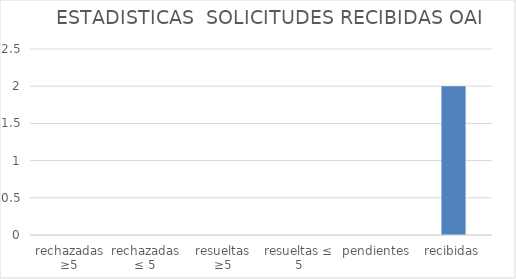
| Category | Series 0 |
|---|---|
| rechazadas ≥5 | 0 |
| rechazadas ≤ 5 | 0 |
| resueltas ≥5 | 0 |
| resueltas ≤ 5 | 0 |
| pendientes | 0 |
| recibidas | 2 |